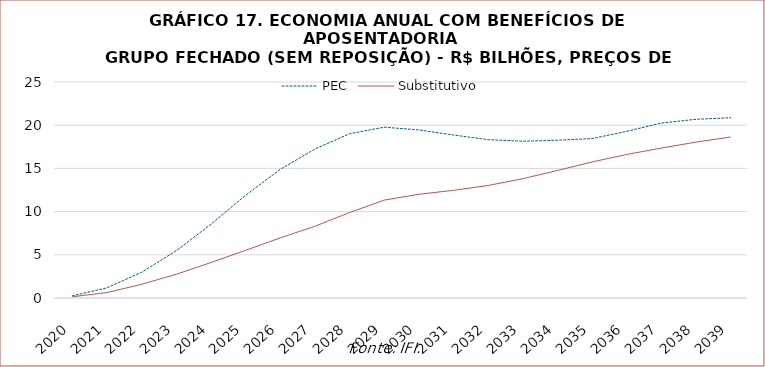
| Category | PEC | Substitutivo |
|---|---|---|
| 2020.0 | 250502811.852 | 142934873.66 |
| 2021.0 | 1173857841.638 | 629358964.6 |
| 2022.0 | 2977384314.614 | 1585716852.27 |
| 2023.0 | 5470945712.417 | 2746602624.858 |
| 2024.0 | 8532384990.199 | 4105393849.712 |
| 2025.0 | 11884408236.049 | 5515445067.129 |
| 2026.0 | 14894507169.516 | 6960007313.364 |
| 2027.0 | 17234647149.167 | 8301053447.796 |
| 2028.0 | 19009072939.243 | 9889489629.571 |
| 2029.0 | 19772304283.785 | 11328793051.483 |
| 2030.0 | 19450856674.272 | 12003569285.961 |
| 2031.0 | 18864026316.771 | 12463534535.392 |
| 2032.0 | 18325336548.852 | 13023274375.763 |
| 2033.0 | 18141955482.711 | 13805967442.548 |
| 2034.0 | 18260334882.268 | 14759247420.479 |
| 2035.0 | 18450187106.955 | 15742917324.833 |
| 2036.0 | 19291735788.151 | 16612596063.168 |
| 2037.0 | 20253151296.435 | 17354125760.176 |
| 2038.0 | 20682305235.948 | 18042154792.981 |
| 2039.0 | 20869440530.357 | 18633999170.987 |